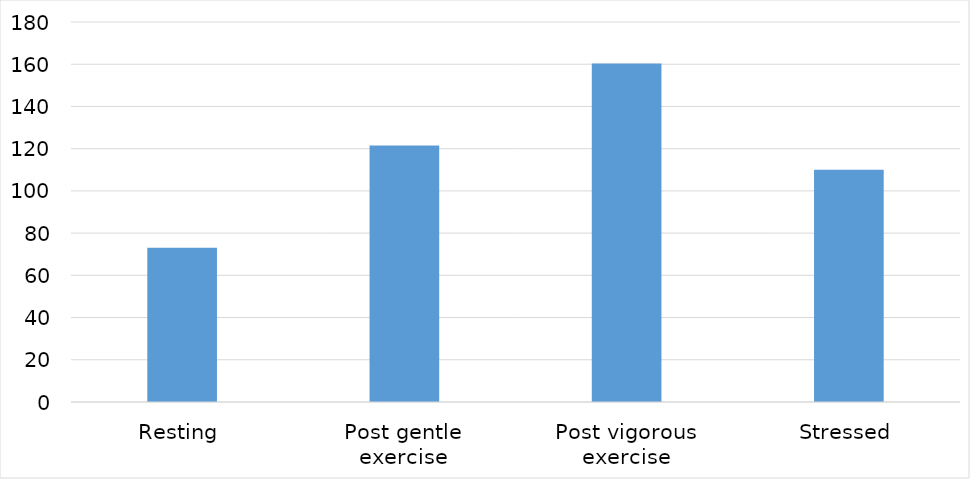
| Category | Series 0 |
|---|---|
| Resting | 73.1 |
| Post gentle exercise | 121.5 |
| Post vigorous exercise | 160.3 |
| Stressed | 110 |